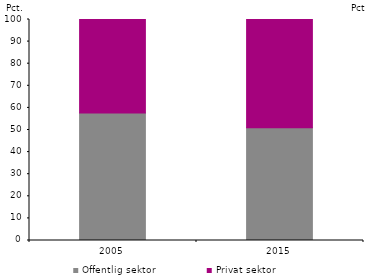
| Category | Offentlig sektor | Privat sektor |
|---|---|---|
| 2005.0 | 57.7 | 42.3 |
| 2015.0 | 51 | 49 |